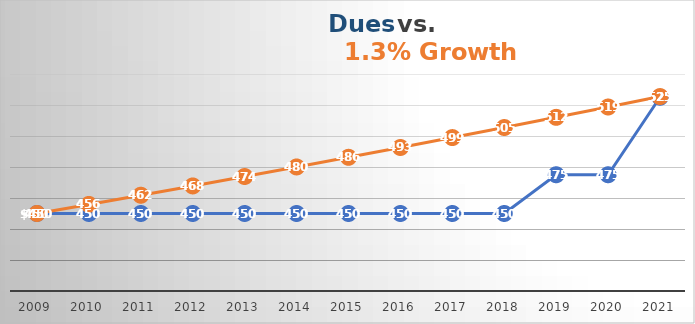
| Category | Series 0 | Series 1 |
|---|---|---|
| 2009.0 | 450 | 450 |
| 2010.0 | 450 | 455.85 |
| 2011.0 | 450 | 461.776 |
| 2012.0 | 450 | 467.779 |
| 2013.0 | 450 | 473.86 |
| 2014.0 | 450 | 480.02 |
| 2015.0 | 450 | 486.261 |
| 2016.0 | 450 | 492.582 |
| 2017.0 | 450 | 498.986 |
| 2018.0 | 450 | 505.472 |
| 2019.0 | 475 | 512.044 |
| 2020.0 | 475 | 518.7 |
| 2021.0 | 525 | 525.443 |